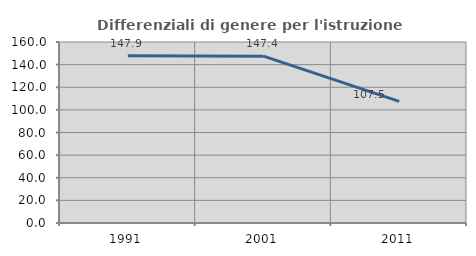
| Category | Differenziali di genere per l'istruzione superiore |
|---|---|
| 1991.0 | 147.901 |
| 2001.0 | 147.448 |
| 2011.0 | 107.478 |